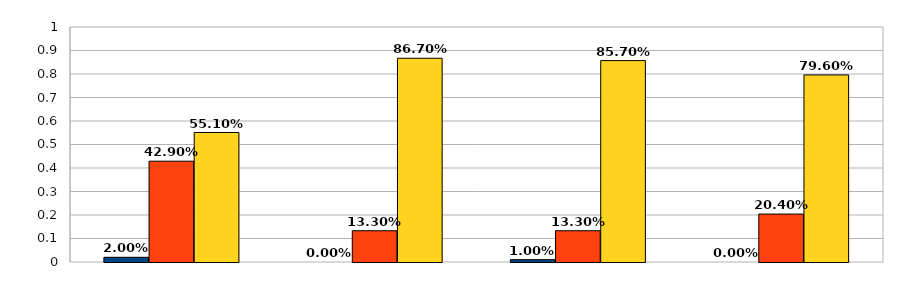
| Category | Series 0 | Series 1 | Series 2 |
|---|---|---|---|
| 0 | 0.02 | 0.429 | 0.551 |
| 1 | 0 | 0.133 | 0.867 |
| 2 | 0.01 | 0.133 | 0.857 |
| 3 | 0 | 0.204 | 0.796 |